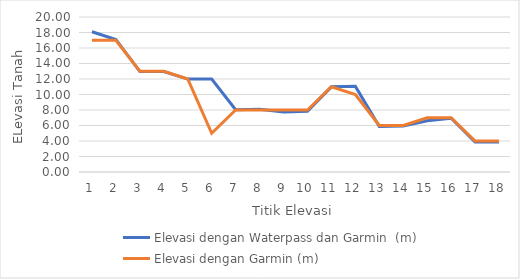
| Category | Elevasi dengan Waterpass dan Garmin  (m) | Elevasi dengan Garmin (m) |
|---|---|---|
| 0 | 18.1 | 17 |
| 1 | 17.1 | 17 |
| 2 | 12.96 | 13 |
| 3 | 12.97 | 13 |
| 4 | 11.99 | 12 |
| 5 | 11.99 | 5 |
| 6 | 8.03 | 8 |
| 7 | 8.09 | 8 |
| 8 | 7.73 | 8 |
| 9 | 7.83 | 8 |
| 10 | 10.99 | 11 |
| 11 | 11.05 | 10 |
| 12 | 5.86 | 6 |
| 13 | 5.92 | 6 |
| 14 | 6.62 | 7 |
| 15 | 6.94 | 7 |
| 16 | 3.88 | 4 |
| 17 | 3.88 | 4 |